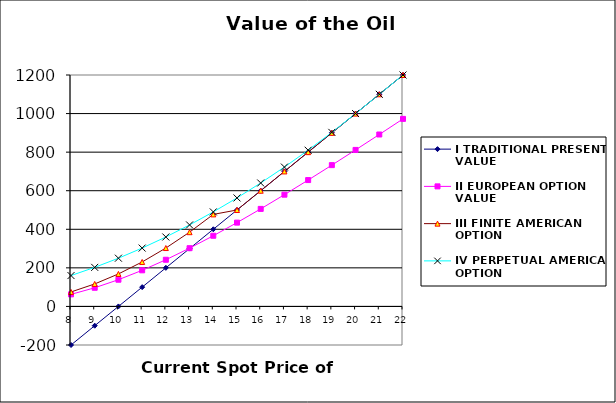
| Category | I TRADITIONAL PRESENT VALUE | II EUROPEAN OPTION VALUE | III FINITE AMERICAN OPTION | IV PERPETUAL AMERICAN OPTION |
|---|---|---|---|---|
| 8.0 | -200 | 62.571 | 75.108 | 160.052 |
| 9.0 | -100 | 96.75 | 116.58 | 202.558 |
| 10.0 | 0 | 138.547 | 168.431 | 250.062 |
| 11.0 | 100 | 187.248 | 230.558 | 302.565 |
| 12.0 | 200 | 242.021 | 302.791 | 360.066 |
| 13.0 | 300 | 302.013 | 385.002 | 422.565 |
| 14.0 | 400 | 366.424 | 477.165 | 490.062 |
| 15.0 | 500 | 434.531 | 500 | 562.558 |
| 16.0 | 600 | 505.705 | 600 | 640.051 |
| 17.0 | 700 | 579.409 | 700 | 722.542 |
| 18.0 | 800 | 655.191 | 800 | 810.03 |
| 19.0 | 900 | 732.674 | 900 | 902.517 |
| 20.0 | 1000 | 811.548 | 1000 | 1000 |
| 21.0 | 1100 | 891.559 | 1100 | 1100 |
| 22.0 | 1200 | 972.497 | 1200 | 1200 |